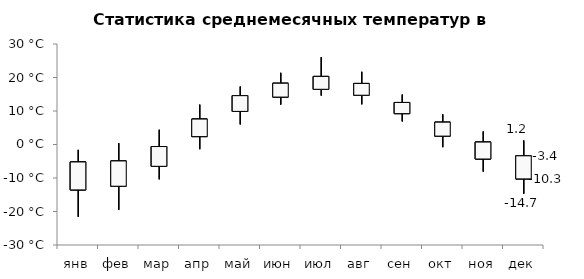
| Category | μ-σ | макс | мин | μ+σ |
|---|---|---|---|---|
| янв | -13.557 | -1.6 | -21.6 | -5.219 |
| фев | -12.455 | 0.4 | -19.5 | -4.915 |
| мар | -6.507 | 4.4 | -10.4 | -0.608 |
| апр | 2.359 | 11.9 | -1.4 | 7.59 |
| май | 9.882 | 17.3 | 6 | 14.579 |
| июн | 14.16 | 21.4 | 11.9 | 18.287 |
| июл | 16.48 | 26.1 | 14.6 | 20.326 |
| авг | 14.707 | 21.7 | 12 | 18.225 |
| сен | 9.216 | 14.9 | 6.9 | 12.544 |
| окт | 2.503 | 9 | -0.8 | 6.663 |
| ноя | -4.327 | 3.9 | -8.1 | 0.725 |
| дек | -10.264 | 1.2 | -14.7 | -3.378 |